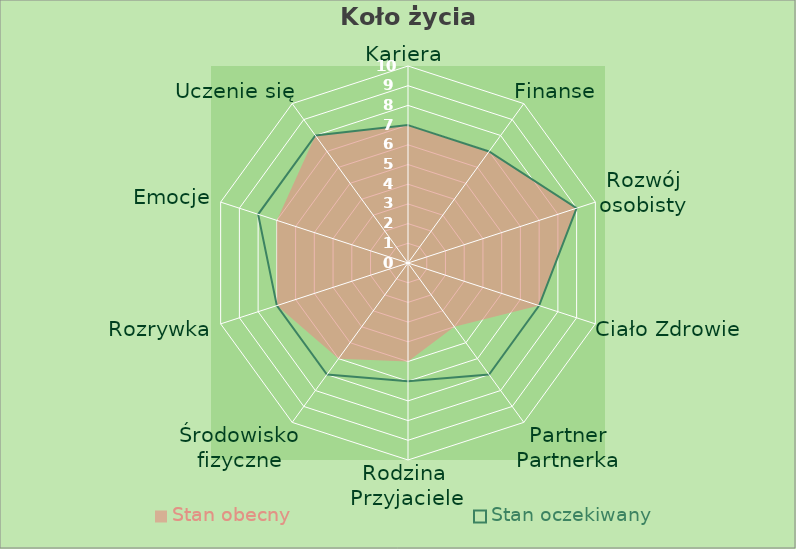
| Category | Stan obecny  | Stan oczekiwany  |
|---|---|---|
| Kariera | 7 | 7 |
| Finanse | 7 | 7 |
| Rozwój osobisty | 9 | 9 |
| Ciało Zdrowie | 7 | 7 |
| Partner Partnerka | 4 | 7 |
| Rodzina  Przyjaciele | 5 | 6 |
| Środowisko fizyczne | 6 | 7 |
| Rozrywka | 7 | 7 |
| Emocje | 7 | 8 |
| Uczenie się | 8 | 8 |